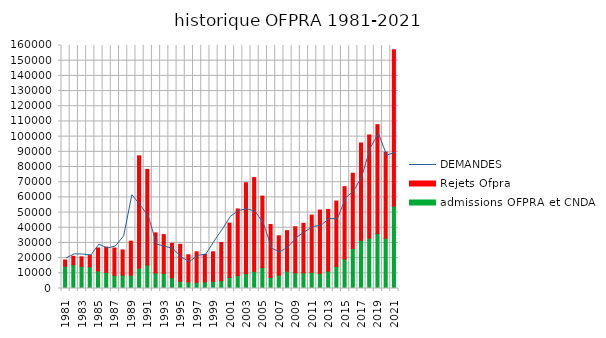
| Category | admissions OFPRA et CNDA | Rejets Ofpra |
|---|---|---|
| 1981 | 14586 | 4181 |
| 1982 | 15670 | 5540 |
| 1983 | 14608 | 6252 |
| 1984 | 14314 | 7614 |
| 1985 | 11539 | 15123 |
| 1986 | 10645 | 16629 |
| 1987 | 8704 | 17924 |
| 1988 | 8794 | 16631 |
| 1989 | 8770 | 22400 |
| 1990 | 13486 | 73866 |
| 1991 | 15467 | 62975 |
| 1992 | 10266 | 26380 |
| 1993 | 9914 | 25575 |
| 1994 | 7025 | 22685 |
| 1995 | 4742 | 24354 |
| 1996 | 4344 | 17859 |
| 1997 | 4112 | 20055 |
| 1998 | 4342 | 18063 |
| 1999 | 4659 | 19492 |
| 2000 | 5185 | 25093 |
| 2001 | 7323 | 35730 |
| 2002 | 8495 | 43880 |
| 2003 | 9790 | 59818 |
| 2004 | 11292 | 61760 |
| 2005 | 13770 | 47088 |
| 2006 | 7354 | 34786 |
| 2007 | 8781 | 25922 |
| 2008 | 11441 | 26648 |
| 2009 | 10373 | 30283 |
| 2010 | 10340 | 32571 |
| 2011 | 10702 | 37619 |
| 2012 | 9976 | 41672 |
| 2013 | 11371 | 40706 |
| 2014 | 14512 | 43066 |
| 2015 | 19450 | 47597 |
| 2016 | 26428 | 49447 |
| 2017 | 31734 | 64092 |
| 2018 | 33216 | 67891 |
| 2019 | 36139 | 71738 |
| 2020 | 33101 | 56673 |
| 2021 | 54384 | 102849 |